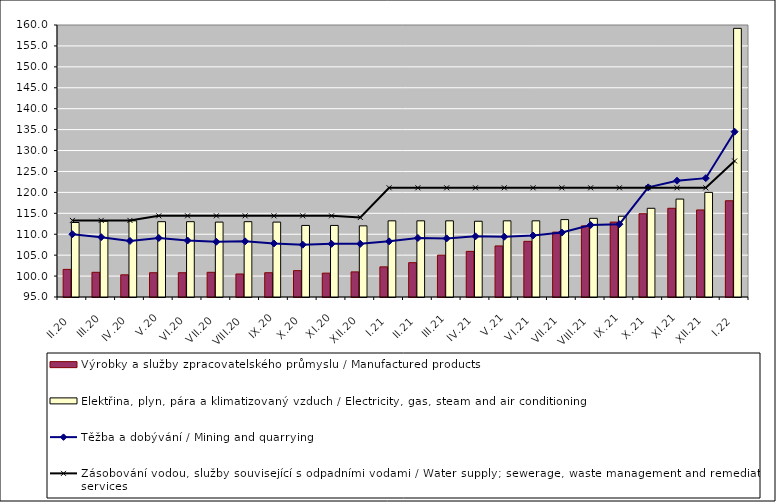
| Category | Výrobky a služby zpracovatelského průmyslu / Manufactured products | Elektřina, plyn, pára a klimatizovaný vzduch / Electricity, gas, steam and air conditioning |
|---|---|---|
| II.20 | 101.6 | 112.8 |
| III.20 | 100.9 | 113.1 |
| IV.20 | 100.3 | 113.2 |
| V.20 | 100.8 | 113 |
| VI.20 | 100.8 | 113 |
| VII.20 | 100.9 | 112.9 |
| VIII.20 | 100.5 | 113 |
| IX.20 | 100.8 | 112.9 |
| X.20 | 101.3 | 112.1 |
| XI.20 | 100.7 | 112.1 |
| XII.20 | 101 | 112 |
| I.21 | 102.2 | 113.2 |
| II.21 | 103.2 | 113.2 |
| III.21 | 105 | 113.2 |
| IV.21 | 105.9 | 113.1 |
| V.21 | 107.2 | 113.2 |
| VI.21 | 108.3 | 113.2 |
| VII.21 | 110.5 | 113.5 |
| VIII.21 | 112 | 113.8 |
| IX.21 | 112.9 | 114.3 |
| X.21 | 114.9 | 116.2 |
| XI.21 | 116.2 | 118.4 |
| XII.21 | 115.8 | 120 |
| I.22 | 118 | 159.2 |